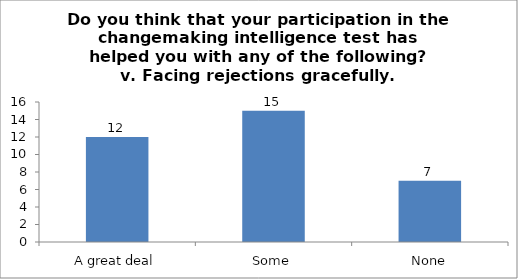
| Category | Do you think that your participation in the changemaking intelligence test has helped you with any of the following?
v. Facing rejections gracefully. |
|---|---|
| A great deal | 12 |
| Some | 15 |
| None | 7 |